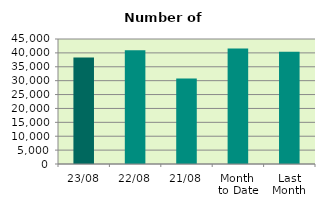
| Category | Series 0 |
|---|---|
| 23/08 | 38332 |
| 22/08 | 40978 |
| 21/08 | 30820 |
| Month 
to Date | 41581.059 |
| Last
Month | 40410.857 |